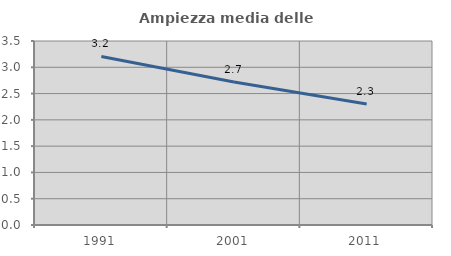
| Category | Ampiezza media delle famiglie |
|---|---|
| 1991.0 | 3.207 |
| 2001.0 | 2.721 |
| 2011.0 | 2.301 |